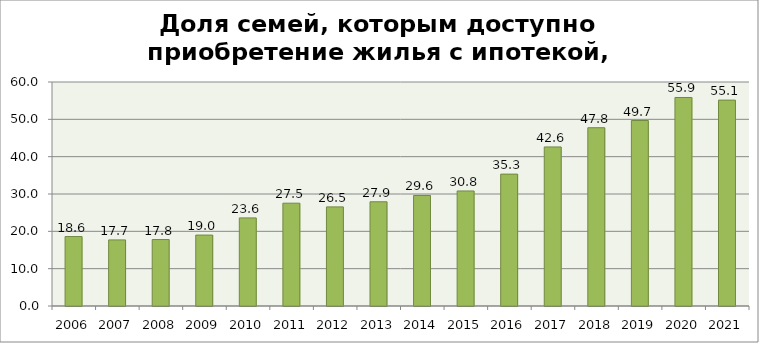
| Category | Series 0 |
|---|---|
| 2006 | 18.6 |
| 2007 | 17.7 |
| 2008 | 17.8 |
| 2009 | 19 |
| 2010 | 23.6 |
| 2011 | 27.543 |
| 2012 | 26.55 |
| 2013 | 27.916 |
| 2014 | 29.608 |
| 2015 | 30.813 |
| 2016 | 35.327 |
| 2017 | 42.604 |
| 2018 | 47.752 |
| 2019 | 49.681 |
| 2020 | 55.852 |
| 2021 | 55.148 |